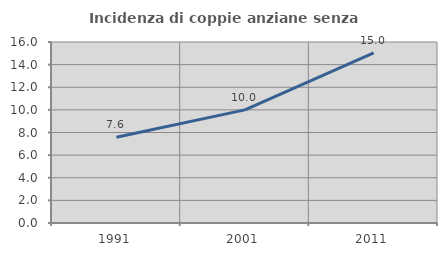
| Category | Incidenza di coppie anziane senza figli  |
|---|---|
| 1991.0 | 7.585 |
| 2001.0 | 9.998 |
| 2011.0 | 15.031 |